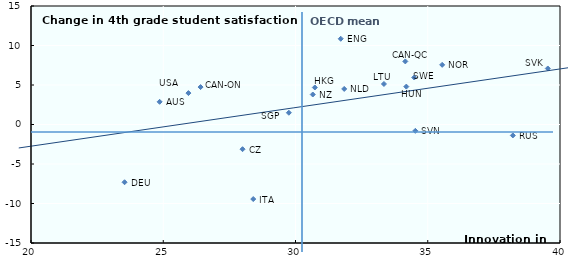
| Category | Change in 4th grade student satisfaction (2007-2015) |
|---|---|
| 24.86236065802155 | 2.871 |
| 26.41069453385446 | 4.738 |
| 34.151712508876976 | 7.985 |
| 27.99829092620979 | -3.126 |
| 23.537108547148677 | -7.309 |
| 30.731168077572757 | 4.684 |
| 34.190599255746456 | 4.798 |
| 28.402220072461642 | -9.434 |
| 33.344330555296764 | 5.13 |
| 31.841841492033375 | 4.5 |
| 30.652353898930272 | 3.797 |
| 35.54521768255994 | 7.552 |
| 38.21759911460091 | -1.384 |
| 29.748494369415628 | 1.489 |
| 39.53851314837733 | 7.091 |
| 34.53082479407698 | -0.802 |
| 34.489196848677345 | 5.95 |
| 31.71066827992079 | 10.853 |
| 25.951431177341984 | 3.976 |